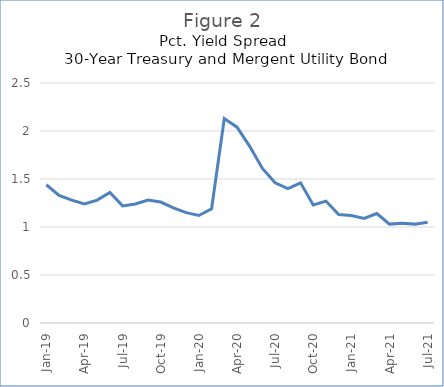
| Category | Series 0 |
|---|---|
| 2019-01-01 | 1.44 |
| 2019-02-01 | 1.33 |
| 2019-03-01 | 1.28 |
| 2019-04-01 | 1.24 |
| 2019-05-01 | 1.28 |
| 2019-06-01 | 1.36 |
| 2019-07-01 | 1.22 |
| 2019-08-01 | 1.24 |
| 2019-09-01 | 1.28 |
| 2019-10-01 | 1.26 |
| 2019-11-01 | 1.2 |
| 2019-12-01 | 1.15 |
| 2020-01-01 | 1.12 |
| 2020-02-01 | 1.19 |
| 2020-03-01 | 2.13 |
| 2020-04-01 | 2.04 |
| 2020-05-01 | 1.84 |
| 2020-06-01 | 1.61 |
| 2020-07-01 | 1.46 |
| 2020-08-01 | 1.4 |
| 2020-09-01 | 1.46 |
| 2020-10-01 | 1.23 |
| 2020-11-01 | 1.27 |
| 2020-12-01 | 1.13 |
| 2021-01-01 | 1.12 |
| 2021-02-01 | 1.09 |
| 2021-03-01 | 1.14 |
| 2021-04-01 | 1.03 |
| 2021-05-01 | 1.04 |
| 2021-06-01 | 1.03 |
| 2021-07-01 | 1.05 |